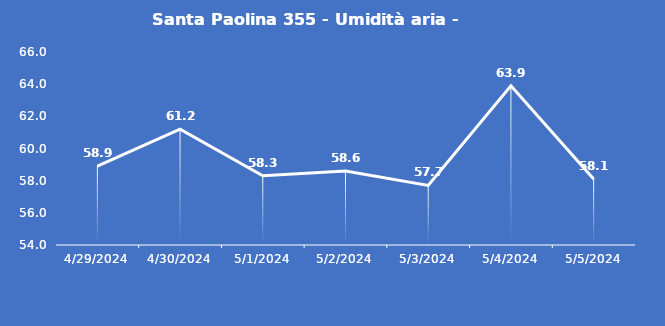
| Category | Santa Paolina 355 - Umidità aria - Grezzo (%) |
|---|---|
| 4/29/24 | 58.9 |
| 4/30/24 | 61.2 |
| 5/1/24 | 58.3 |
| 5/2/24 | 58.6 |
| 5/3/24 | 57.7 |
| 5/4/24 | 63.9 |
| 5/5/24 | 58.1 |